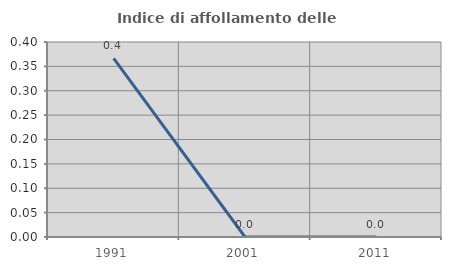
| Category | Indice di affollamento delle abitazioni  |
|---|---|
| 1991.0 | 0.366 |
| 2001.0 | 0 |
| 2011.0 | 0 |